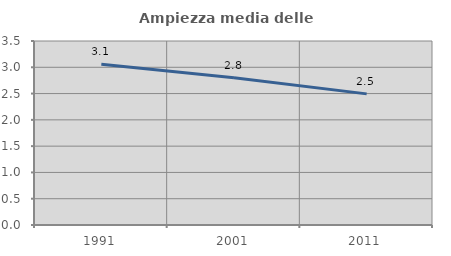
| Category | Ampiezza media delle famiglie |
|---|---|
| 1991.0 | 3.057 |
| 2001.0 | 2.803 |
| 2011.0 | 2.494 |